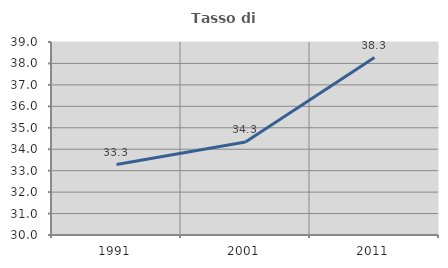
| Category | Tasso di occupazione   |
|---|---|
| 1991.0 | 33.287 |
| 2001.0 | 34.332 |
| 2011.0 | 38.276 |